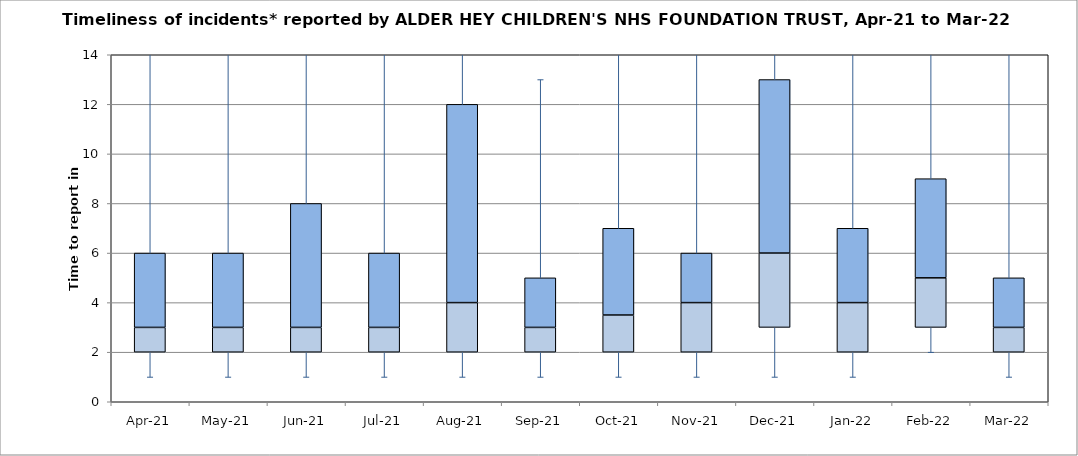
| Category | Series 0 | Series 1 | Series 2 |
|---|---|---|---|
| Apr-21 | 2 | 1 | 3 |
| May-21 | 2 | 1 | 3 |
| Jun-21 | 2 | 1 | 5 |
| Jul-21 | 2 | 1 | 3 |
| Aug-21 | 2 | 2 | 8 |
| Sep-21 | 2 | 1 | 2 |
| Oct-21 | 2 | 1.5 | 3.5 |
| Nov-21 | 2 | 2 | 2 |
| Dec-21 | 3 | 3 | 7 |
| Jan-22 | 2 | 2 | 3 |
| Feb-22 | 3 | 2 | 4 |
| Mar-22 | 2 | 1 | 2 |